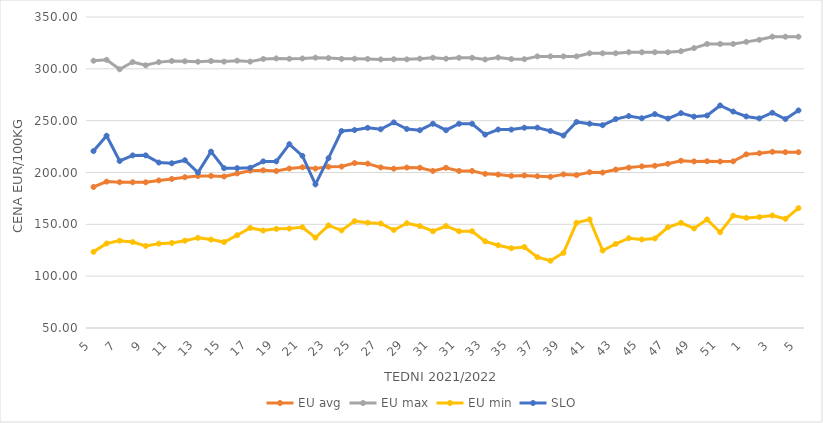
| Category | EU avg | EU max | EU min | SLO |
|---|---|---|---|---|
| 5.0 | 186.04 | 307.79 | 123.461 | 220.65 |
| 6.0 | 191.206 | 308.7 | 131.528 | 235.46 |
| 7.0 | 190.629 | 299.55 | 134.262 | 211.1 |
| 8.0 | 190.57 | 306.55 | 132.97 | 216.51 |
| 9.0 | 190.562 | 303.4 | 129.173 | 216.54 |
| 10.0 | 192.373 | 306.48 | 131.374 | 209.61 |
| 11.0 | 193.79 | 307.58 | 132.024 | 208.91 |
| 12.0 | 195.449 | 307.33 | 134.212 | 211.87 |
| 13.0 | 196.631 | 306.85 | 136.936 | 199.93 |
| 14.0 | 196.702 | 307.56 | 135.297 | 220.15 |
| 15.0 | 196.13 | 306.96 | 132.893 | 204.2 |
| 16.0 | 199.1 | 307.87 | 139.462 | 204.2 |
| 17.0 | 201.754 | 306.98 | 146.538 | 204.51 |
| 18.0 | 202.13 | 309.49 | 144.017 | 210.72 |
| 19.0 | 201.439 | 310.06 | 145.644 | 210.68 |
| 20.0 | 203.834 | 309.69 | 145.911 | 227.32 |
| 21.0 | 205.04 | 309.99 | 147.188 | 216.08 |
| 22.0 | 203.79 | 310.76 | 137.177 | 188.6 |
| 23.0 | 205.51 | 310.41 | 148.928 | 213.84 |
| 24.0 | 205.73 | 309.64 | 144.161 | 239.99 |
| 25.0 | 209.095 | 309.74 | 153.081 | 240.99 |
| 26.0 | 208.551 | 309.55 | 151.599 | 243.11 |
| 27.0 | 204.914 | 309.08 | 150.789 | 241.72 |
| 28.0 | 203.681 | 309.21 | 144.56 | 248.33 |
| 29.0 | 204.773 | 309.15 | 151.052 | 241.96 |
| 30.0 | 204.558 | 309.78 | 148.33 | 240.79 |
| 31.0 | 201.483 | 310.67 | 143.33 | 247 |
| 30.0 | 204.558 | 309.78 | 148.33 | 240.79 |
| 31.0 | 201.483 | 310.67 | 143.33 | 247 |
| 32.0 | 201.483 | 310.67 | 143.33 | 247 |
| 33.0 | 198.691 | 309 | 133.607 | 236.54 |
| 34.0 | 198.027 | 310.9 | 129.797 | 241.45 |
| 35.0 | 196.72 | 309.41 | 126.926 | 241.39 |
| 36.0 | 197.157 | 309.28 | 128.099 | 243.19 |
| 37.0 | 196.375 | 312 | 118.364 | 243.28 |
| 38.0 | 195.821 | 312 | 114.892 | 240.06 |
| 39.0 | 198.179 | 312 | 122.517 | 235.66 |
| 40.0 | 197.482 | 312 | 151.488 | 248.77 |
| 41.0 | 200.22 | 315 | 154.74 | 247.07 |
| 42.0 | 199.965 | 315 | 124.748 | 245.64 |
| 43.0 | 202.804 | 315 | 131.104 | 251.53 |
| 44.0 | 204.713 | 316 | 136.6 | 254.42 |
| 45.0 | 205.906 | 316 | 135.362 | 252.35 |
| 46.0 | 206.476 | 316 | 136.39 | 256.33 |
| 47.0 | 208.415 | 316 | 147.192 | 252.01 |
| 48.0 | 211.314 | 317 | 151.41 | 257.25 |
| 49.0 | 210.677 | 320 | 146.064 | 253.87 |
| 50.0 | 210.823 | 324 | 154.698 | 254.94 |
| 51.0 | 210.59 | 324 | 142.382 | 264.65 |
| 52.0 | 210.763 | 324 | 158.333 | 258.8 |
| 1.0 | 217.49 | 326 | 156.222 | 254.09 |
| 2.0 | 218.55 | 328 | 156.969 | 252.15 |
| 3.0 | 219.967 | 331 | 158.511 | 257.65 |
| 4.0 | 219.57 | 331 | 155.346 | 251.6 |
| 5.0 | 219.575 | 331 | 165.59 | 259.87 |